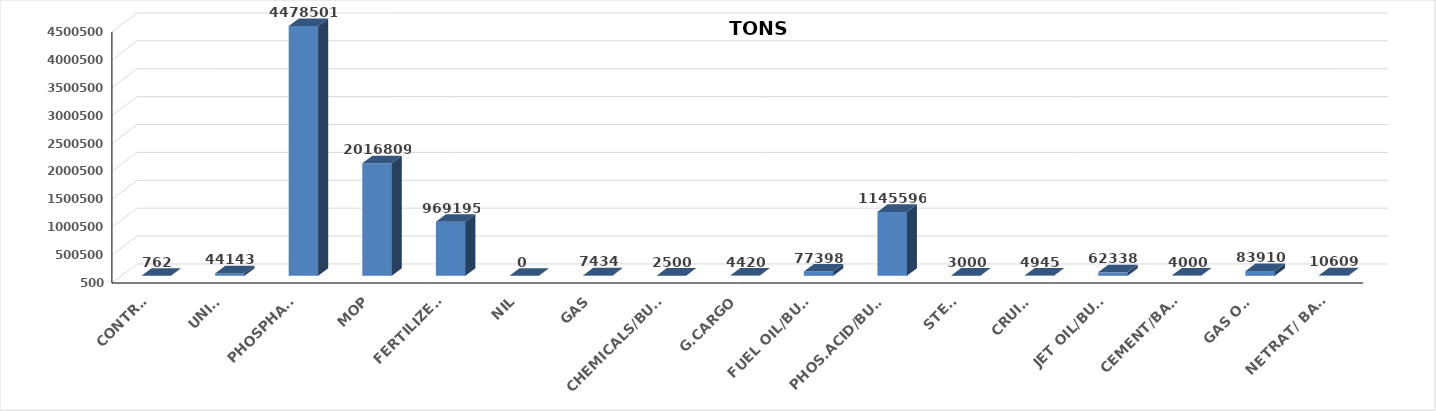
| Category | Series 0 |
|---|---|
| CONTRS. | 762 |
| UNITS | 44143 |
| PHOSPHATE | 4478501 |
| MOP | 2016809 |
| FERTILIZERS | 969195 |
| NIL | 0 |
| GAS | 7434 |
| CHEMICALS/BULK | 2500 |
| G.CARGO | 4420 |
| FUEL OIL/BULK | 77398 |
| PHOS.ACID/BULK | 1145596 |
| STEEL | 3000 |
| CRUISE | 4945 |
| JET OIL/BULK | 62338 |
| CEMENT/BAGS | 4000 |
| GAS OIL | 83910 |
| NETRAT/ BAGS | 10609 |